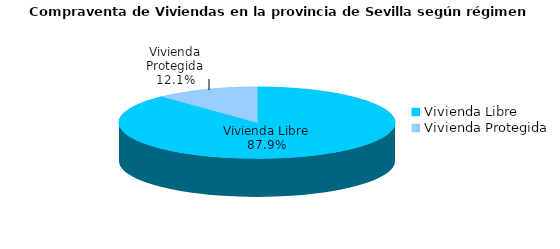
| Category | Series 0 | Series 1 |
|---|---|---|
| Vivienda Libre | 929 | 0.879 |
| Vivienda Protegida | 128 | 0.121 |